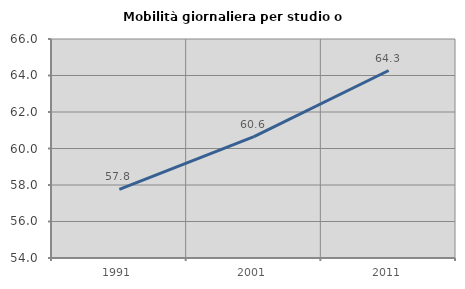
| Category | Mobilità giornaliera per studio o lavoro |
|---|---|
| 1991.0 | 57.759 |
| 2001.0 | 60.646 |
| 2011.0 | 64.274 |